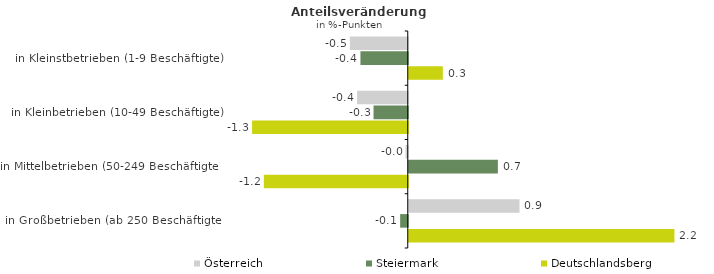
| Category | Österreich | Steiermark | Deutschlandsberg |
|---|---|---|---|
| in Kleinstbetrieben (1-9 Beschäftigte) | -0.48 | -0.393 | 0.283 |
| in Kleinbetrieben (10-49 Beschäftigte) | -0.42 | -0.284 | -1.292 |
| in Mittelbetrieben (50-249 Beschäftigte) | -0.019 | 0.74 | -1.194 |
| in Großbetrieben (ab 250 Beschäftigte) | 0.919 | -0.063 | 2.205 |